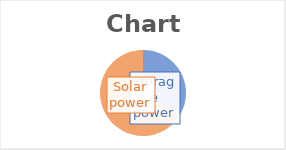
| Category | Series 0 |
|---|---|
| Storage power | 8800 |
| Solar power | 17750 |